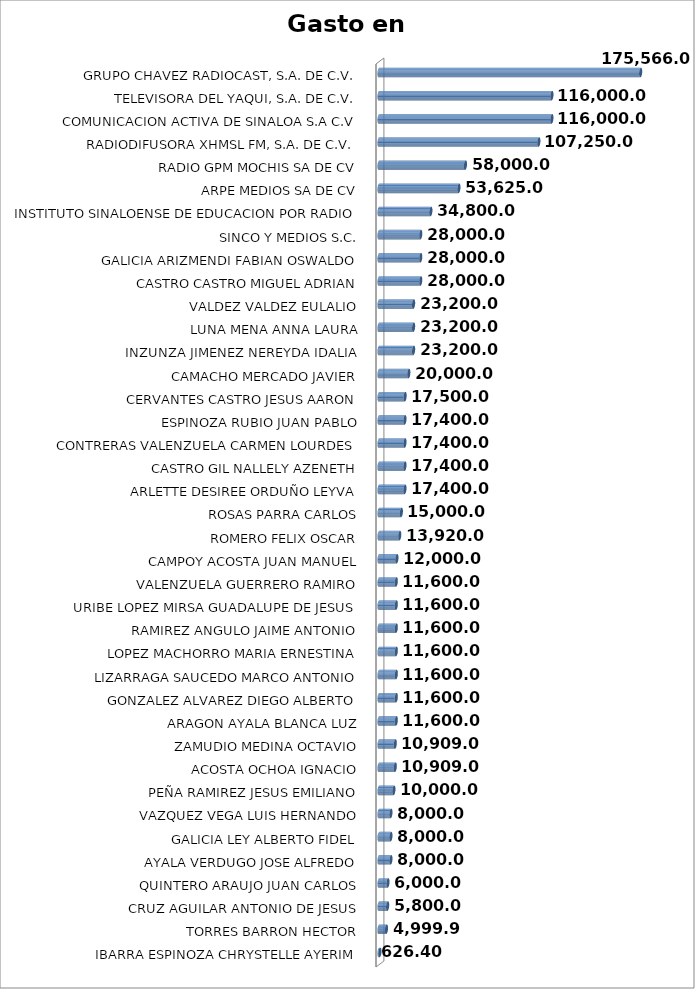
| Category | SUMA |
|---|---|
| IBARRA ESPINOZA CHRYSTELLE AYERIM | 626.4 |
| TORRES BARRON HECTOR | 4999.99 |
| CRUZ AGUILAR ANTONIO DE JESUS | 5800 |
| QUINTERO ARAUJO JUAN CARLOS | 6000 |
| AYALA VERDUGO JOSE ALFREDO | 8000 |
| GALICIA LEY ALBERTO FIDEL | 8000 |
| VAZQUEZ VEGA LUIS HERNANDO | 8000 |
| PEÑA RAMIREZ JESUS EMILIANO | 10000 |
| ACOSTA OCHOA IGNACIO | 10909.09 |
| ZAMUDIO MEDINA OCTAVIO | 10909.09 |
| ARAGON AYALA BLANCA LUZ | 11600 |
| GONZALEZ ALVAREZ DIEGO ALBERTO | 11600 |
| LIZARRAGA SAUCEDO MARCO ANTONIO | 11600 |
| LOPEZ MACHORRO MARIA ERNESTINA | 11600 |
| RAMIREZ ANGULO JAIME ANTONIO | 11600 |
| URIBE LOPEZ MIRSA GUADALUPE DE JESUS | 11600 |
| VALENZUELA GUERRERO RAMIRO | 11600 |
| CAMPOY ACOSTA JUAN MANUEL | 12000 |
| ROMERO FELIX OSCAR | 13920 |
| ROSAS PARRA CARLOS | 15000 |
| ARLETTE DESIREE ORDUÑO LEYVA | 17400 |
| CASTRO GIL NALLELY AZENETH | 17400 |
| CONTRERAS VALENZUELA CARMEN LOURDES | 17400 |
| ESPINOZA RUBIO JUAN PABLO | 17400 |
| CERVANTES CASTRO JESUS AARON | 17500 |
| CAMACHO MERCADO JAVIER | 20000 |
| INZUNZA JIMENEZ NEREYDA IDALIA | 23200 |
| LUNA MENA ANNA LAURA | 23200 |
| VALDEZ VALDEZ EULALIO | 23200 |
| CASTRO CASTRO MIGUEL ADRIAN | 28000 |
| GALICIA ARIZMENDI FABIAN OSWALDO | 28000 |
| SINCO Y MEDIOS S.C. | 28000 |
| INSTITUTO SINALOENSE DE EDUCACION POR RADIO | 34800 |
| ARPE MEDIOS SA DE CV | 53625 |
| RADIO GPM MOCHIS SA DE CV | 58000 |
| RADIODIFUSORA XHMSL FM, S.A. DE C.V. | 107250 |
| COMUNICACION ACTIVA DE SINALOA S.A C.V | 116000 |
| TELEVISORA DEL YAQUI, S.A. DE C.V. | 116000 |
| GRUPO CHAVEZ RADIOCAST, S.A. DE C.V. | 175566 |